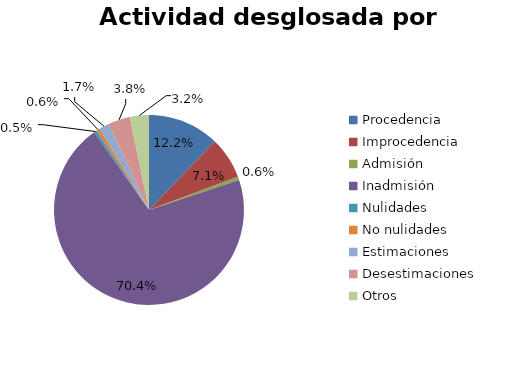
| Category | Series 0 |
|---|---|
| Procedencia | 512 |
| Improcedencia | 300 |
| Admisión | 24 |
| Inadmisión | 2960 |
| Nulidades | 20 |
| No nulidades | 25 |
| Estimaciones | 72 |
| Desestimaciones | 158 |
| Otros | 136 |